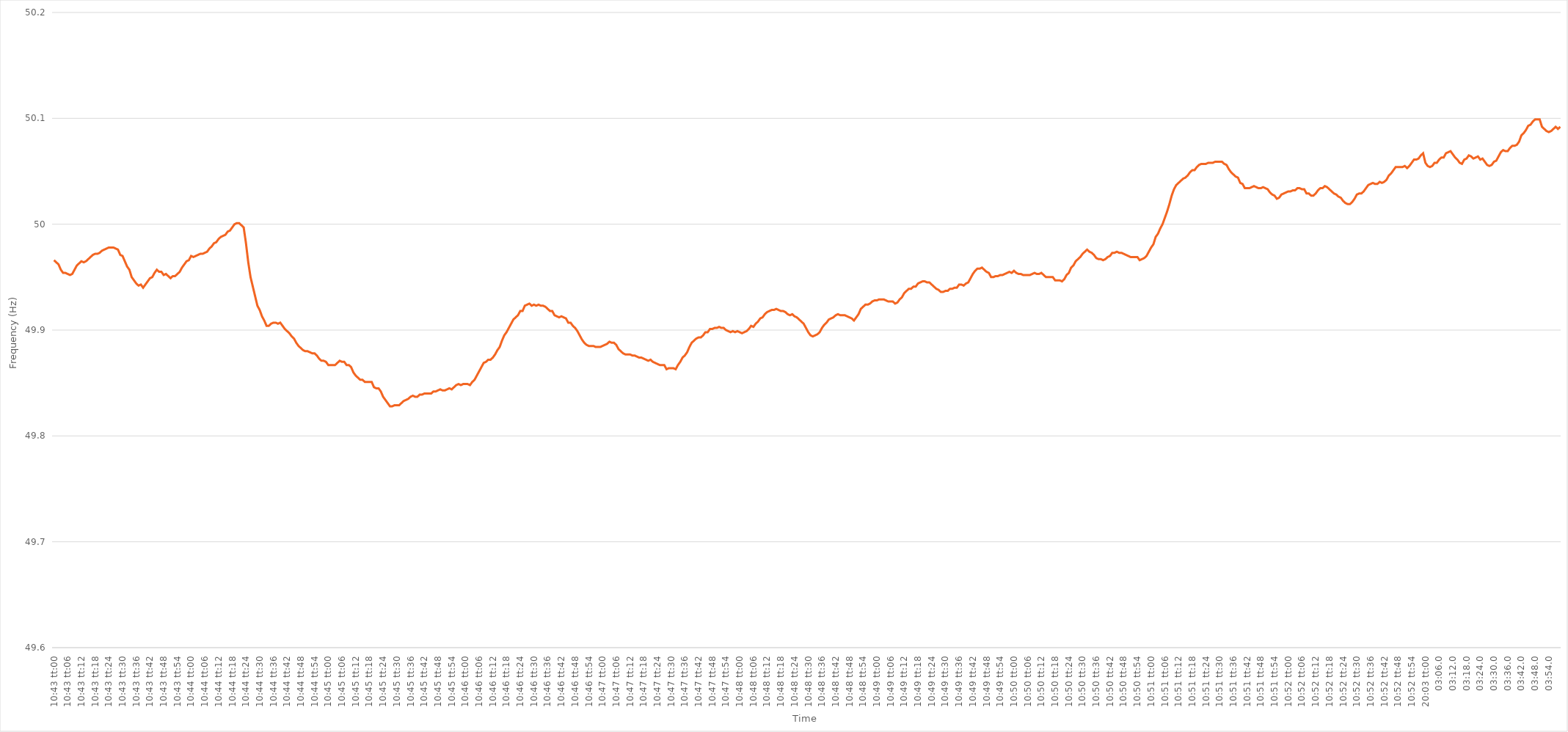
| Category | Series 0 |
|---|---|
| 0.4465277777777778 | 49.966 |
| 0.44653935185185184 | 49.964 |
| 0.44655092592592593 | 49.962 |
| 0.4465625 | 49.957 |
| 0.44657407407407407 | 49.954 |
| 0.4465856481481481 | 49.954 |
| 0.44659722222222226 | 49.953 |
| 0.4466087962962963 | 49.952 |
| 0.4466203703703704 | 49.953 |
| 0.44663194444444443 | 49.957 |
| 0.4466435185185185 | 49.961 |
| 0.44665509259259256 | 49.963 |
| 0.4466666666666667 | 49.965 |
| 0.44667824074074075 | 49.964 |
| 0.44668981481481485 | 49.965 |
| 0.4467013888888889 | 49.967 |
| 0.446712962962963 | 49.969 |
| 0.446724537037037 | 49.971 |
| 0.44673611111111106 | 49.972 |
| 0.4467476851851852 | 49.972 |
| 0.44675925925925924 | 49.973 |
| 0.44677083333333334 | 49.975 |
| 0.4467824074074074 | 49.976 |
| 0.4467939814814815 | 49.977 |
| 0.4468055555555555 | 49.978 |
| 0.44681712962962966 | 49.978 |
| 0.4468287037037037 | 49.978 |
| 0.4468402777777778 | 49.977 |
| 0.44685185185185183 | 49.976 |
| 0.44686342592592593 | 49.971 |
| 0.44687499999999997 | 49.97 |
| 0.4468865740740741 | 49.965 |
| 0.44689814814814816 | 49.96 |
| 0.44690972222222225 | 49.957 |
| 0.4469212962962963 | 49.95 |
| 0.4469328703703704 | 49.947 |
| 0.4469444444444444 | 49.944 |
| 0.44695601851851857 | 49.942 |
| 0.4469675925925926 | 49.943 |
| 0.44697916666666665 | 49.94 |
| 0.44699074074074074 | 49.943 |
| 0.4470023148148148 | 49.946 |
| 0.4470138888888889 | 49.949 |
| 0.4470254629629629 | 49.95 |
| 0.44703703703703707 | 49.954 |
| 0.4470486111111111 | 49.957 |
| 0.4470601851851852 | 49.955 |
| 0.44707175925925924 | 49.955 |
| 0.44708333333333333 | 49.952 |
| 0.44709490740740737 | 49.953 |
| 0.4471064814814815 | 49.951 |
| 0.44711805555555556 | 49.949 |
| 0.44712962962962965 | 49.951 |
| 0.4471412037037037 | 49.951 |
| 0.4471527777777778 | 49.953 |
| 0.4471643518518518 | 49.955 |
| 0.447175925925926 | 49.959 |
| 0.4471875 | 49.962 |
| 0.4471990740740741 | 49.965 |
| 0.44721064814814815 | 49.966 |
| 0.4472222222222222 | 49.97 |
| 0.4472337962962963 | 49.969 |
| 0.4472453703703703 | 49.97 |
| 0.44725694444444447 | 49.971 |
| 0.4472685185185185 | 49.972 |
| 0.4472800925925926 | 49.972 |
| 0.44729166666666664 | 49.973 |
| 0.44730324074074074 | 49.974 |
| 0.4473148148148148 | 49.977 |
| 0.4473263888888889 | 49.979 |
| 0.44733796296296297 | 49.982 |
| 0.44734953703703706 | 49.983 |
| 0.4473611111111111 | 49.986 |
| 0.4473726851851852 | 49.988 |
| 0.44738425925925923 | 49.989 |
| 0.4473958333333334 | 49.99 |
| 0.4474074074074074 | 49.993 |
| 0.4474189814814815 | 49.994 |
| 0.44743055555555555 | 49.997 |
| 0.44744212962962965 | 50 |
| 0.4474537037037037 | 50.001 |
| 0.4474652777777777 | 50.001 |
| 0.4474768518518519 | 49.999 |
| 0.4474884259259259 | 49.997 |
| 0.4475 | 49.982 |
| 0.44751157407407405 | 49.964 |
| 0.44752314814814814 | 49.95 |
| 0.4475347222222222 | 49.941 |
| 0.44754629629629633 | 49.932 |
| 0.44755787037037037 | 49.923 |
| 0.44756944444444446 | 49.919 |
| 0.4475810185185185 | 49.913 |
| 0.4475925925925926 | 49.909 |
| 0.44760416666666664 | 49.904 |
| 0.4476157407407408 | 49.904 |
| 0.4476273148148148 | 49.906 |
| 0.4476388888888889 | 49.907 |
| 0.44765046296296296 | 49.907 |
| 0.44766203703703705 | 49.906 |
| 0.4476736111111111 | 49.907 |
| 0.44768518518518513 | 49.904 |
| 0.4476967592592593 | 49.901 |
| 0.4477083333333333 | 49.899 |
| 0.4477199074074074 | 49.897 |
| 0.44773148148148145 | 49.894 |
| 0.44774305555555555 | 49.892 |
| 0.4477546296296296 | 49.888 |
| 0.44776620370370374 | 49.885 |
| 0.4477777777777778 | 49.883 |
| 0.44778935185185187 | 49.881 |
| 0.4478009259259259 | 49.88 |
| 0.4478125 | 49.88 |
| 0.44782407407407404 | 49.879 |
| 0.4478356481481482 | 49.878 |
| 0.44784722222222223 | 49.878 |
| 0.4478587962962963 | 49.876 |
| 0.44787037037037036 | 49.873 |
| 0.44788194444444446 | 49.871 |
| 0.4478935185185185 | 49.871 |
| 0.44790509259259265 | 49.87 |
| 0.4479166666666667 | 49.867 |
| 0.4479282407407407 | 49.867 |
| 0.4479398148148148 | 49.867 |
| 0.44795138888888886 | 49.867 |
| 0.44796296296296295 | 49.869 |
| 0.447974537037037 | 49.871 |
| 0.44798611111111114 | 49.87 |
| 0.4479976851851852 | 49.87 |
| 0.4480092592592593 | 49.867 |
| 0.4480208333333333 | 49.867 |
| 0.4480324074074074 | 49.865 |
| 0.44804398148148145 | 49.86 |
| 0.4480555555555556 | 49.857 |
| 0.44806712962962963 | 49.855 |
| 0.44807870370370373 | 49.853 |
| 0.44809027777777777 | 49.853 |
| 0.44810185185185186 | 49.851 |
| 0.4481134259259259 | 49.851 |
| 0.44812500000000005 | 49.851 |
| 0.4481365740740741 | 49.851 |
| 0.4481481481481482 | 49.846 |
| 0.4481597222222222 | 49.845 |
| 0.44817129629629626 | 49.845 |
| 0.44818287037037036 | 49.842 |
| 0.4481944444444444 | 49.837 |
| 0.44820601851851855 | 49.834 |
| 0.4482175925925926 | 49.831 |
| 0.4482291666666667 | 49.828 |
| 0.4482407407407407 | 49.828 |
| 0.4482523148148148 | 49.829 |
| 0.44826388888888885 | 49.829 |
| 0.448275462962963 | 49.829 |
| 0.44828703703703704 | 49.831 |
| 0.44829861111111113 | 49.833 |
| 0.4483101851851852 | 49.834 |
| 0.44832175925925927 | 49.835 |
| 0.4483333333333333 | 49.837 |
| 0.44834490740740746 | 49.838 |
| 0.4483564814814815 | 49.837 |
| 0.4483680555555556 | 49.837 |
| 0.44837962962962963 | 49.839 |
| 0.44839120370370367 | 49.839 |
| 0.44840277777777776 | 49.84 |
| 0.4484143518518518 | 49.84 |
| 0.44842592592592595 | 49.84 |
| 0.4484375 | 49.84 |
| 0.4484490740740741 | 49.842 |
| 0.4484606481481481 | 49.842 |
| 0.4484722222222222 | 49.843 |
| 0.44848379629629626 | 49.844 |
| 0.4484953703703704 | 49.843 |
| 0.44850694444444444 | 49.843 |
| 0.44851851851851854 | 49.844 |
| 0.4485300925925926 | 49.845 |
| 0.44854166666666667 | 49.844 |
| 0.4485532407407407 | 49.846 |
| 0.44856481481481486 | 49.848 |
| 0.4485763888888889 | 49.849 |
| 0.448587962962963 | 49.848 |
| 0.44859953703703703 | 49.849 |
| 0.4486111111111111 | 49.849 |
| 0.44862268518518517 | 49.849 |
| 0.4486342592592592 | 49.848 |
| 0.44864583333333335 | 49.851 |
| 0.4486574074074074 | 49.853 |
| 0.4486689814814815 | 49.857 |
| 0.4486805555555555 | 49.861 |
| 0.4486921296296296 | 49.865 |
| 0.44870370370370366 | 49.869 |
| 0.4487152777777778 | 49.87 |
| 0.44872685185185185 | 49.872 |
| 0.44873842592592594 | 49.872 |
| 0.44875 | 49.874 |
| 0.4487615740740741 | 49.877 |
| 0.4487731481481481 | 49.881 |
| 0.44878472222222227 | 49.884 |
| 0.4487962962962963 | 49.89 |
| 0.4488078703703704 | 49.895 |
| 0.44881944444444444 | 49.898 |
| 0.44883101851851853 | 49.902 |
| 0.44884259259259257 | 49.906 |
| 0.4488541666666667 | 49.91 |
| 0.44886574074074076 | 49.912 |
| 0.4488773148148148 | 49.914 |
| 0.4488888888888889 | 49.918 |
| 0.44890046296296293 | 49.918 |
| 0.448912037037037 | 49.923 |
| 0.44892361111111106 | 49.924 |
| 0.4489351851851852 | 49.925 |
| 0.44894675925925925 | 49.923 |
| 0.44895833333333335 | 49.924 |
| 0.4489699074074074 | 49.923 |
| 0.4489814814814815 | 49.924 |
| 0.4489930555555555 | 49.923 |
| 0.44900462962962967 | 49.923 |
| 0.4490162037037037 | 49.922 |
| 0.4490277777777778 | 49.92 |
| 0.44903935185185184 | 49.918 |
| 0.44905092592592594 | 49.918 |
| 0.4490625 | 49.914 |
| 0.4490740740740741 | 49.913 |
| 0.44908564814814816 | 49.912 |
| 0.44909722222222226 | 49.913 |
| 0.4491087962962963 | 49.912 |
| 0.44912037037037034 | 49.911 |
| 0.44913194444444443 | 49.907 |
| 0.44914351851851847 | 49.907 |
| 0.4491550925925926 | 49.904 |
| 0.44916666666666666 | 49.902 |
| 0.44917824074074075 | 49.899 |
| 0.4491898148148148 | 49.895 |
| 0.4492013888888889 | 49.891 |
| 0.4492129629629629 | 49.888 |
| 0.4492245370370371 | 49.886 |
| 0.4492361111111111 | 49.885 |
| 0.4492476851851852 | 49.885 |
| 0.44925925925925925 | 49.885 |
| 0.44927083333333334 | 49.884 |
| 0.4492824074074074 | 49.884 |
| 0.44929398148148153 | 49.884 |
| 0.44930555555555557 | 49.885 |
| 0.44931712962962966 | 49.886 |
| 0.4493287037037037 | 49.887 |
| 0.44934027777777774 | 49.889 |
| 0.44935185185185184 | 49.888 |
| 0.4493634259259259 | 49.888 |
| 0.449375 | 49.886 |
| 0.44938657407407406 | 49.882 |
| 0.44939814814814816 | 49.88 |
| 0.4494097222222222 | 49.878 |
| 0.4494212962962963 | 49.877 |
| 0.44943287037037033 | 49.877 |
| 0.4494444444444445 | 49.877 |
| 0.4494560185185185 | 49.876 |
| 0.4494675925925926 | 49.876 |
| 0.44947916666666665 | 49.875 |
| 0.44949074074074075 | 49.874 |
| 0.4495023148148148 | 49.874 |
| 0.44951388888888894 | 49.873 |
| 0.449525462962963 | 49.872 |
| 0.44953703703703707 | 49.871 |
| 0.4495486111111111 | 49.872 |
| 0.4495601851851852 | 49.87 |
| 0.44957175925925924 | 49.869 |
| 0.4495833333333333 | 49.868 |
| 0.44959490740740743 | 49.867 |
| 0.44960648148148147 | 49.867 |
| 0.44961805555555556 | 49.867 |
| 0.4496296296296296 | 49.863 |
| 0.4496412037037037 | 49.864 |
| 0.44965277777777773 | 49.864 |
| 0.4496643518518519 | 49.864 |
| 0.4496759259259259 | 49.863 |
| 0.4496875 | 49.867 |
| 0.44969907407407406 | 49.87 |
| 0.44971064814814815 | 49.874 |
| 0.4497222222222222 | 49.876 |
| 0.44973379629629634 | 49.879 |
| 0.4497453703703704 | 49.884 |
| 0.4497569444444445 | 49.888 |
| 0.4497685185185185 | 49.89 |
| 0.4497800925925926 | 49.892 |
| 0.44979166666666665 | 49.893 |
| 0.4498032407407408 | 49.893 |
| 0.44981481481481483 | 49.895 |
| 0.4498263888888889 | 49.898 |
| 0.44983796296296297 | 49.898 |
| 0.449849537037037 | 49.901 |
| 0.4498611111111111 | 49.901 |
| 0.44987268518518514 | 49.902 |
| 0.4498842592592593 | 49.902 |
| 0.44989583333333333 | 49.903 |
| 0.4499074074074074 | 49.902 |
| 0.44991898148148146 | 49.902 |
| 0.44993055555555556 | 49.9 |
| 0.4499421296296296 | 49.899 |
| 0.44995370370370374 | 49.898 |
| 0.4499652777777778 | 49.899 |
| 0.4499768518518519 | 49.898 |
| 0.4499884259259259 | 49.899 |
| 0.45 | 49.898 |
| 0.45001157407407405 | 49.897 |
| 0.4500231481481482 | 49.898 |
| 0.45003472222222224 | 49.899 |
| 0.45004629629629633 | 49.901 |
| 0.45005787037037037 | 49.904 |
| 0.4500694444444444 | 49.903 |
| 0.4500810185185185 | 49.906 |
| 0.45009259259259254 | 49.908 |
| 0.4501041666666667 | 49.911 |
| 0.45011574074074073 | 49.912 |
| 0.4501273148148148 | 49.915 |
| 0.45013888888888887 | 49.917 |
| 0.45015046296296296 | 49.918 |
| 0.450162037037037 | 49.919 |
| 0.45017361111111115 | 49.919 |
| 0.4501851851851852 | 49.92 |
| 0.4501967592592593 | 49.919 |
| 0.4502083333333333 | 49.918 |
| 0.4502199074074074 | 49.918 |
| 0.45023148148148145 | 49.917 |
| 0.4502430555555556 | 49.915 |
| 0.45025462962962964 | 49.914 |
| 0.45026620370370374 | 49.915 |
| 0.4502777777777778 | 49.913 |
| 0.4502893518518518 | 49.912 |
| 0.4503009259259259 | 49.91 |
| 0.45031249999999995 | 49.908 |
| 0.4503240740740741 | 49.906 |
| 0.45033564814814814 | 49.902 |
| 0.45034722222222223 | 49.898 |
| 0.45035879629629627 | 49.895 |
| 0.45037037037037037 | 49.894 |
| 0.4503819444444444 | 49.895 |
| 0.45039351851851855 | 49.896 |
| 0.4504050925925926 | 49.898 |
| 0.4504166666666667 | 49.902 |
| 0.4504282407407407 | 49.905 |
| 0.4504398148148148 | 49.907 |
| 0.45045138888888886 | 49.91 |
| 0.450462962962963 | 49.911 |
| 0.45047453703703705 | 49.912 |
| 0.45048611111111114 | 49.914 |
| 0.4504976851851852 | 49.915 |
| 0.4505092592592593 | 49.914 |
| 0.4505208333333333 | 49.914 |
| 0.45053240740740735 | 49.914 |
| 0.4505439814814815 | 49.913 |
| 0.45055555555555554 | 49.912 |
| 0.45056712962962964 | 49.911 |
| 0.4505787037037037 | 49.909 |
| 0.45059027777777777 | 49.912 |
| 0.4506018518518518 | 49.915 |
| 0.45061342592592596 | 49.92 |
| 0.450625 | 49.922 |
| 0.4506365740740741 | 49.924 |
| 0.45064814814814813 | 49.924 |
| 0.4506597222222222 | 49.925 |
| 0.45067129629629626 | 49.927 |
| 0.4506828703703704 | 49.928 |
| 0.45069444444444445 | 49.928 |
| 0.45070601851851855 | 49.929 |
| 0.4507175925925926 | 49.929 |
| 0.4507291666666667 | 49.929 |
| 0.4507407407407407 | 49.928 |
| 0.45075231481481487 | 49.927 |
| 0.4507638888888889 | 49.927 |
| 0.45077546296296295 | 49.927 |
| 0.45078703703703704 | 49.925 |
| 0.4507986111111111 | 49.926 |
| 0.4508101851851852 | 49.929 |
| 0.4508217592592592 | 49.931 |
| 0.45083333333333336 | 49.935 |
| 0.4508449074074074 | 49.937 |
| 0.4508564814814815 | 49.939 |
| 0.45086805555555554 | 49.939 |
| 0.45087962962962963 | 49.941 |
| 0.45089120370370367 | 49.941 |
| 0.4509027777777778 | 49.944 |
| 0.45091435185185186 | 49.945 |
| 0.45092592592592595 | 49.946 |
| 0.4509375 | 49.946 |
| 0.4509490740740741 | 49.945 |
| 0.4509606481481481 | 49.945 |
| 0.4509722222222223 | 49.943 |
| 0.4509837962962963 | 49.941 |
| 0.45099537037037035 | 49.939 |
| 0.45100694444444445 | 49.938 |
| 0.4510185185185185 | 49.936 |
| 0.4510300925925926 | 49.936 |
| 0.4510416666666666 | 49.937 |
| 0.45105324074074077 | 49.937 |
| 0.4510648148148148 | 49.939 |
| 0.4510763888888889 | 49.939 |
| 0.45108796296296294 | 49.94 |
| 0.45109953703703703 | 49.94 |
| 0.4511111111111111 | 49.943 |
| 0.4511226851851852 | 49.943 |
| 0.45113425925925926 | 49.942 |
| 0.45114583333333336 | 49.944 |
| 0.4511574074074074 | 49.945 |
| 0.4511689814814815 | 49.949 |
| 0.45118055555555553 | 49.953 |
| 0.4511921296296297 | 49.956 |
| 0.4512037037037037 | 49.958 |
| 0.4512152777777778 | 49.958 |
| 0.45122685185185185 | 49.959 |
| 0.4512384259259259 | 49.957 |
| 0.45125 | 49.955 |
| 0.451261574074074 | 49.954 |
| 0.4512731481481482 | 49.95 |
| 0.4512847222222222 | 49.95 |
| 0.4512962962962963 | 49.951 |
| 0.45130787037037035 | 49.951 |
| 0.45131944444444444 | 49.952 |
| 0.4513310185185185 | 49.952 |
| 0.45134259259259263 | 49.953 |
| 0.45135416666666667 | 49.954 |
| 0.45136574074074076 | 49.955 |
| 0.4513773148148148 | 49.954 |
| 0.4513888888888889 | 49.956 |
| 0.45140046296296293 | 49.954 |
| 0.4514120370370371 | 49.953 |
| 0.4514236111111111 | 49.953 |
| 0.4514351851851852 | 49.952 |
| 0.45144675925925926 | 49.952 |
| 0.45145833333333335 | 49.952 |
| 0.4514699074074074 | 49.952 |
| 0.45148148148148143 | 49.953 |
| 0.4514930555555556 | 49.954 |
| 0.4515046296296296 | 49.953 |
| 0.4515162037037037 | 49.953 |
| 0.45152777777777775 | 49.954 |
| 0.45153935185185184 | 49.952 |
| 0.4515509259259259 | 49.95 |
| 0.45156250000000003 | 49.95 |
| 0.45157407407407407 | 49.95 |
| 0.45158564814814817 | 49.95 |
| 0.4515972222222222 | 49.947 |
| 0.4516087962962963 | 49.947 |
| 0.45162037037037034 | 49.947 |
| 0.4516319444444445 | 49.946 |
| 0.4516435185185185 | 49.948 |
| 0.4516550925925926 | 49.952 |
| 0.45166666666666666 | 49.954 |
| 0.45167824074074076 | 49.959 |
| 0.4516898148148148 | 49.961 |
| 0.45170138888888894 | 49.965 |
| 0.451712962962963 | 49.967 |
| 0.451724537037037 | 49.969 |
| 0.4517361111111111 | 49.972 |
| 0.45174768518518515 | 49.974 |
| 0.45175925925925925 | 49.976 |
| 0.4517708333333333 | 49.974 |
| 0.45178240740740744 | 49.973 |
| 0.4517939814814815 | 49.971 |
| 0.45180555555555557 | 49.968 |
| 0.4518171296296296 | 49.967 |
| 0.4518287037037037 | 49.967 |
| 0.45184027777777774 | 49.966 |
| 0.4518518518518519 | 49.967 |
| 0.45186342592592593 | 49.969 |
| 0.451875 | 49.97 |
| 0.45188657407407407 | 49.973 |
| 0.45189814814814816 | 49.973 |
| 0.4519097222222222 | 49.974 |
| 0.45192129629629635 | 49.973 |
| 0.4519328703703704 | 49.973 |
| 0.4519444444444444 | 49.972 |
| 0.4519560185185185 | 49.971 |
| 0.45196759259259256 | 49.97 |
| 0.45197916666666665 | 49.969 |
| 0.4519907407407407 | 49.969 |
| 0.45200231481481484 | 49.969 |
| 0.4520138888888889 | 49.969 |
| 0.452025462962963 | 49.966 |
| 0.452037037037037 | 49.967 |
| 0.4520486111111111 | 49.968 |
| 0.45206018518518515 | 49.97 |
| 0.4520717592592593 | 49.974 |
| 0.45208333333333334 | 49.978 |
| 0.45209490740740743 | 49.981 |
| 0.45210648148148147 | 49.988 |
| 0.45211805555555556 | 49.991 |
| 0.4521296296296296 | 49.996 |
| 0.45214120370370375 | 50 |
| 0.4521527777777778 | 50.006 |
| 0.4521643518518519 | 50.012 |
| 0.4521759259259259 | 50.019 |
| 0.45218749999999996 | 50.027 |
| 0.45219907407407406 | 50.033 |
| 0.4522106481481481 | 50.037 |
| 0.45222222222222225 | 50.039 |
| 0.4522337962962963 | 50.041 |
| 0.4522453703703704 | 50.043 |
| 0.4522569444444444 | 50.044 |
| 0.4522685185185185 | 50.046 |
| 0.45228009259259255 | 50.049 |
| 0.4522916666666667 | 50.051 |
| 0.45230324074074074 | 50.051 |
| 0.45231481481481484 | 50.054 |
| 0.4523263888888889 | 50.056 |
| 0.45233796296296297 | 50.057 |
| 0.452349537037037 | 50.057 |
| 0.45236111111111116 | 50.057 |
| 0.4523726851851852 | 50.058 |
| 0.4523842592592593 | 50.058 |
| 0.45239583333333333 | 50.058 |
| 0.4524074074074074 | 50.059 |
| 0.45241898148148146 | 50.059 |
| 0.4524305555555555 | 50.059 |
| 0.45244212962962965 | 50.059 |
| 0.4524537037037037 | 50.057 |
| 0.4524652777777778 | 50.056 |
| 0.4524768518518518 | 50.052 |
| 0.4524884259259259 | 50.049 |
| 0.45249999999999996 | 50.047 |
| 0.4525115740740741 | 50.045 |
| 0.45252314814814815 | 50.044 |
| 0.45253472222222224 | 50.039 |
| 0.4525462962962963 | 50.038 |
| 0.4525578703703704 | 50.034 |
| 0.4525694444444444 | 50.034 |
| 0.45258101851851856 | 50.034 |
| 0.4525925925925926 | 50.035 |
| 0.4526041666666667 | 50.036 |
| 0.45261574074074074 | 50.035 |
| 0.45262731481481483 | 50.034 |
| 0.45263888888888887 | 50.034 |
| 0.452650462962963 | 50.035 |
| 0.45266203703703706 | 50.034 |
| 0.4526736111111111 | 50.033 |
| 0.4526851851851852 | 50.03 |
| 0.45269675925925923 | 50.028 |
| 0.4527083333333333 | 50.027 |
| 0.45271990740740736 | 50.024 |
| 0.4527314814814815 | 50.025 |
| 0.45274305555555555 | 50.028 |
| 0.45275462962962965 | 50.029 |
| 0.4527662037037037 | 50.03 |
| 0.4527777777777778 | 50.031 |
| 0.4527893518518518 | 50.031 |
| 0.45280092592592597 | 50.032 |
| 0.4528125 | 50.032 |
| 0.4528240740740741 | 50.034 |
| 0.45283564814814814 | 50.034 |
| 0.45284722222222223 | 50.033 |
| 0.4528587962962963 | 50.033 |
| 0.4528703703703704 | 50.029 |
| 0.45288194444444446 | 50.029 |
| 0.4528935185185185 | 50.027 |
| 0.4529050925925926 | 50.027 |
| 0.45291666666666663 | 50.029 |
| 0.45292824074074073 | 50.032 |
| 0.45293981481481477 | 50.034 |
| 0.4529513888888889 | 50.034 |
| 0.45296296296296296 | 50.036 |
| 0.45297453703703705 | 50.035 |
| 0.4529861111111111 | 50.033 |
| 0.4529976851851852 | 50.031 |
| 0.4530092592592592 | 50.029 |
| 0.4530208333333334 | 50.028 |
| 0.4530324074074074 | 50.026 |
| 0.4530439814814815 | 50.025 |
| 0.45305555555555554 | 50.022 |
| 0.45306712962962964 | 50.02 |
| 0.4530787037037037 | 50.019 |
| 0.45309027777777783 | 50.019 |
| 0.45310185185185187 | 50.021 |
| 0.45311342592592596 | 50.024 |
| 0.453125 | 50.028 |
| 0.45313657407407404 | 50.029 |
| 0.45314814814814813 | 50.029 |
| 0.45315972222222217 | 50.031 |
| 0.4531712962962963 | 50.034 |
| 0.45318287037037036 | 50.037 |
| 0.45319444444444446 | 50.038 |
| 0.4532060185185185 | 50.039 |
| 0.4532175925925926 | 50.038 |
| 0.4532291666666666 | 50.038 |
| 0.4532407407407408 | 50.04 |
| 0.4532523148148148 | 50.039 |
| 0.4532638888888889 | 50.04 |
| 0.45327546296296295 | 50.042 |
| 0.45328703703703704 | 50.046 |
| 0.4532986111111111 | 50.048 |
| 0.45331018518518523 | 50.051 |
| 0.45332175925925927 | 50.054 |
| 0.45333333333333337 | 50.054 |
| 0.4533449074074074 | 50.054 |
| 0.4533564814814815 | 50.054 |
| 0.45336805555555554 | 50.055 |
| 0.4533796296296296 | 50.053 |
| 0.4533912037037037 | 50.055 |
| 0.45340277777777777 | 50.058 |
| 0.45341435185185186 | 50.061 |
| 0.4534259259259259 | 50.061 |
| 0.4534375 | 50.062 |
| 0.45344907407407403 | 50.065 |
| 0.4534606481481482 | 50.067 |
| 0.8354166666666667 | 50.058 |
| 0.8354282407407408 | 50.055 |
| 0.8354398148148148 | 50.054 |
| 0.8354513888888889 | 50.055 |
| 0.835462962962963 | 50.058 |
| 0.835474537037037 | 50.058 |
| 0.835486111111111 | 50.061 |
| 0.8354976851851852 | 50.063 |
| 0.8355092592592593 | 50.063 |
| 0.8355208333333333 | 50.067 |
| 0.8355324074074074 | 50.068 |
| 0.8355439814814815 | 50.069 |
| 0.8355555555555556 | 50.066 |
| 0.8355671296296295 | 50.063 |
| 0.8355787037037037 | 50.061 |
| 0.8355902777777778 | 50.058 |
| 0.8356018518518519 | 50.057 |
| 0.8356134259259259 | 50.061 |
| 0.835625 | 50.062 |
| 0.8356365740740741 | 50.065 |
| 0.8356481481481483 | 50.064 |
| 0.8356597222222222 | 50.062 |
| 0.8356712962962963 | 50.063 |
| 0.8356828703703704 | 50.064 |
| 0.8356944444444445 | 50.061 |
| 0.8357060185185184 | 50.062 |
| 0.8357175925925926 | 50.059 |
| 0.8357291666666667 | 50.056 |
| 0.8357407407407407 | 50.055 |
| 0.8357523148148148 | 50.056 |
| 0.8357638888888889 | 50.059 |
| 0.835775462962963 | 50.06 |
| 0.8357870370370369 | 50.064 |
| 0.8357986111111111 | 50.068 |
| 0.8358101851851852 | 50.07 |
| 0.8358217592592593 | 50.069 |
| 0.8358333333333333 | 50.069 |
| 0.8358449074074074 | 50.072 |
| 0.8358564814814815 | 50.074 |
| 0.8358680555555557 | 50.074 |
| 0.8358796296296296 | 50.075 |
| 0.8358912037037037 | 50.078 |
| 0.8359027777777778 | 50.084 |
| 0.8359143518518519 | 50.086 |
| 0.8359259259259259 | 50.089 |
| 0.8359375 | 50.093 |
| 0.8359490740740741 | 50.094 |
| 0.8359606481481481 | 50.097 |
| 0.8359722222222222 | 50.099 |
| 0.8359837962962963 | 50.099 |
| 0.8359953703703704 | 50.099 |
| 0.8360069444444443 | 50.092 |
| 0.8360185185185185 | 50.09 |
| 0.8360300925925926 | 50.088 |
| 0.8360416666666667 | 50.087 |
| 0.8360532407407407 | 50.088 |
| 0.8360648148148148 | 50.09 |
| 0.8360763888888889 | 50.092 |
| 0.8360879629629631 | 50.09 |
| 0.836099537037037 | 50.092 |